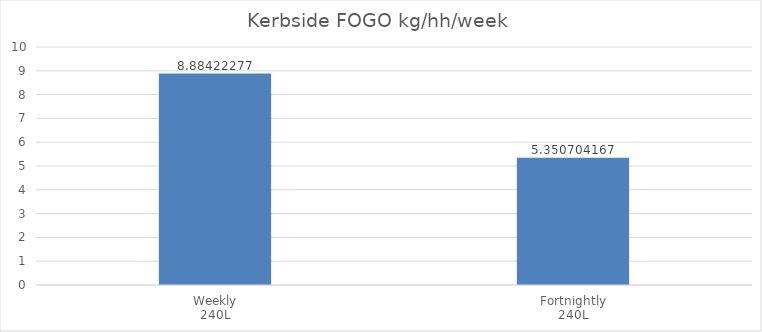
| Category | Series 0 |
|---|---|
| 0 | 8.884 |
| 1 | 5.351 |